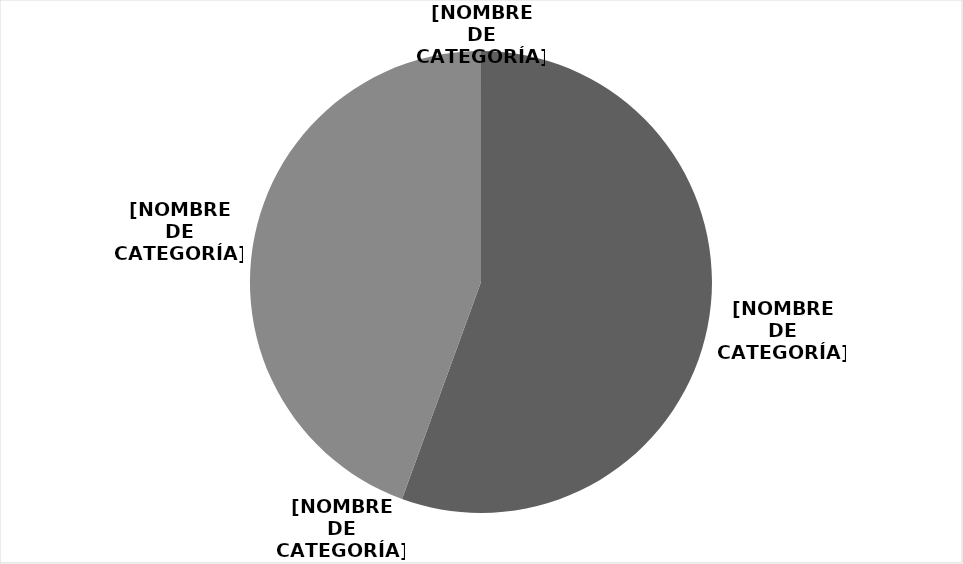
| Category | Series 0 |
|---|---|
| AFB | 0.556 |
| AFD | 0 |
| AFT | 0.444 |
| AFEL | 0 |